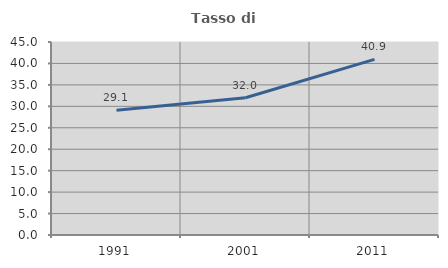
| Category | Tasso di occupazione   |
|---|---|
| 1991.0 | 29.109 |
| 2001.0 | 32 |
| 2011.0 | 40.95 |